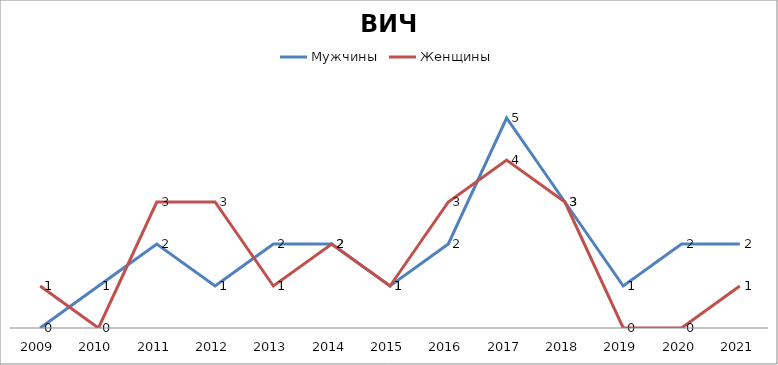
| Category | Мужчины | Женщины |
|---|---|---|
| 2009.0 | 0 | 1 |
| 2010.0 | 1 | 0 |
| 2011.0 | 2 | 3 |
| 2012.0 | 1 | 3 |
| 2013.0 | 2 | 1 |
| 2014.0 | 2 | 2 |
| 2015.0 | 1 | 1 |
| 2016.0 | 2 | 3 |
| 2017.0 | 5 | 4 |
| 2018.0 | 3 | 3 |
| 2019.0 | 1 | 0 |
| 2020.0 | 2 | 0 |
| 2021.0 | 2 | 1 |